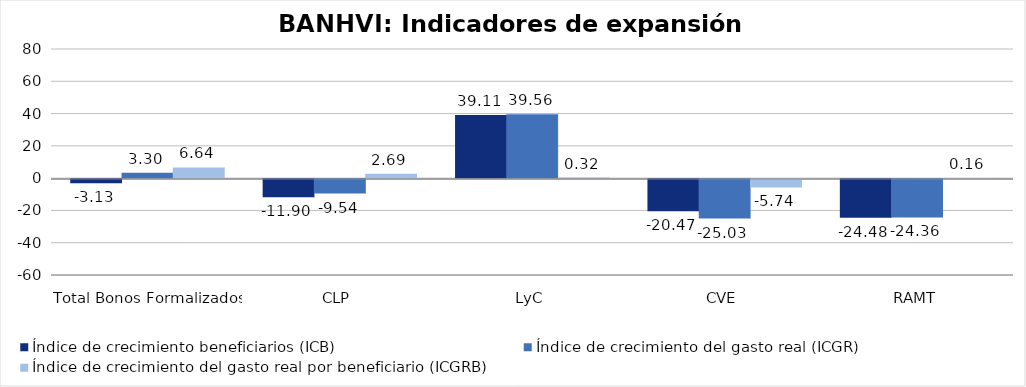
| Category | Índice de crecimiento beneficiarios (ICB)  | Índice de crecimiento del gasto real (ICGR)  | Índice de crecimiento del gasto real por beneficiario (ICGRB)  |
|---|---|---|---|
| Total Bonos Formalizados | -3.126 | 3.303 | 6.636 |
| CLP | -11.904 | -9.537 | 2.687 |
| LyC | 39.108 | 39.559 | 0.325 |
| CVE | -20.47 | -25.033 | -5.737 |
| RAMT | -24.478 | -24.359 | 0.157 |